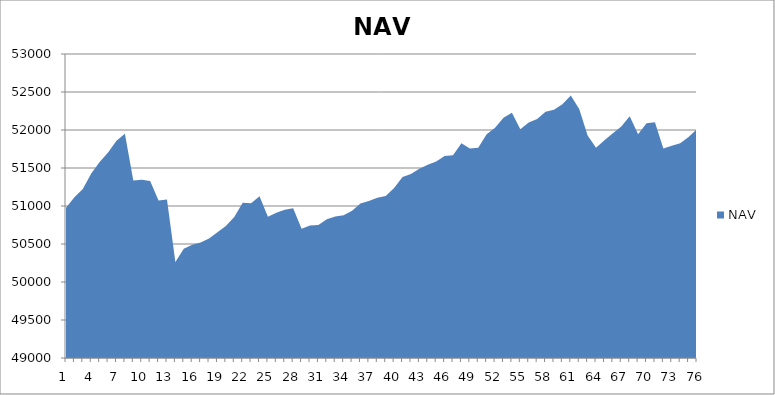
| Category | NAV |
|---|---|
| 0 | 50975.413 |
| 1 | 51115.874 |
| 2 | 51223.542 |
| 3 | 51427.364 |
| 4 | 51580.567 |
| 5 | 51704.692 |
| 6 | 51858.016 |
| 7 | 51951.766 |
| 8 | 51336.067 |
| 9 | 51345.356 |
| 10 | 51328.667 |
| 11 | 51072.985 |
| 12 | 51085.199 |
| 13 | 50261.67 |
| 14 | 50438.394 |
| 15 | 50489.896 |
| 16 | 50518.251 |
| 17 | 50572.468 |
| 18 | 50655.55 |
| 19 | 50737.787 |
| 20 | 50856.035 |
| 21 | 51041.806 |
| 22 | 51034.925 |
| 23 | 51128.589 |
| 24 | 50859.456 |
| 25 | 50911.137 |
| 26 | 50950.007 |
| 27 | 50970.175 |
| 28 | 50701.326 |
| 29 | 50743.495 |
| 30 | 50751.546 |
| 31 | 50826.725 |
| 32 | 50860.533 |
| 33 | 50879.283 |
| 34 | 50936.644 |
| 35 | 51031.381 |
| 36 | 51065.306 |
| 37 | 51109.987 |
| 38 | 51132.251 |
| 39 | 51238.242 |
| 40 | 51380.786 |
| 41 | 51420.042 |
| 42 | 51490.787 |
| 43 | 51541.14 |
| 44 | 51584.924 |
| 45 | 51657.998 |
| 46 | 51667.348 |
| 47 | 51825.763 |
| 48 | 51755.412 |
| 49 | 51767.57 |
| 50 | 51945.15 |
| 51 | 52028.391 |
| 52 | 52160.744 |
| 53 | 52227.009 |
| 54 | 52009.927 |
| 55 | 52099.094 |
| 56 | 52144.26 |
| 57 | 52240.689 |
| 58 | 52266.163 |
| 59 | 52339.405 |
| 60 | 52453.236 |
| 61 | 52275.154 |
| 62 | 51926 |
| 63 | 51766.425 |
| 64 | 51865.11 |
| 65 | 51955.727 |
| 66 | 52045.452 |
| 67 | 52179.744 |
| 68 | 51944.5 |
| 69 | 52088.896 |
| 70 | 52102.813 |
| 71 | 51756.659 |
| 72 | 51793.477 |
| 73 | 51824.02 |
| 74 | 51909.314 |
| 75 | 52012.255 |